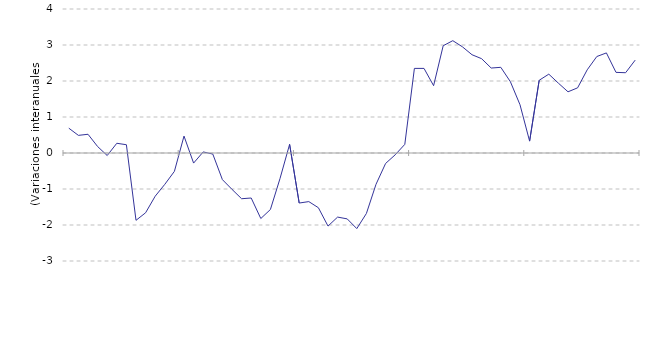
| Category | IPRI, General |
|---|---|
| nan | 0.69 |
| nan | 0.49 |
| nan | 0.52 |
| nan | 0.18 |
| nan | -0.07 |
| 2014.0 | 0.27 |
| nan | 0.23 |
| nan | -1.87 |
| nan | -1.66 |
| nan | -1.2 |
| nan | -0.87 |
| nan | -0.51 |
| nan | 0.47 |
| nan | -0.28 |
| nan | 0.03 |
| nan | -0.03 |
| nan | -0.74 |
| 2015.0 | -1.01 |
| nan | -1.27 |
| nan | -1.25 |
| nan | -1.82 |
| nan | -1.57 |
| nan | -0.71 |
| nan | 0.24 |
| nan | -1.39 |
| nan | -1.35 |
| nan | -1.52 |
| nan | -2.03 |
| nan | -1.78 |
| 2016.0 | -1.83 |
| nan | -2.1 |
| nan | -1.68 |
| nan | -0.87 |
| nan | -0.29 |
| nan | -0.05 |
| nan | 0.24 |
| nan | 2.35 |
| nan | 2.35 |
| nan | 1.87 |
| nan | 2.98 |
| nan | 3.12 |
| 2017.0 | 2.95 |
| nan | 2.73 |
| nan | 2.62 |
| nan | 2.36 |
| nan | 2.38 |
| nan | 1.98 |
| nan | 1.34 |
| nan | 0.33 |
| nan | 2.02 |
| nan | 2.19 |
| nan | 1.94 |
| nan | 1.7 |
| 2018.0 | 1.81 |
| nan | 2.31 |
| nan | 2.68 |
| nan | 2.78 |
| nan | 2.24 |
| nan | 2.23 |
| nan | 2.58 |